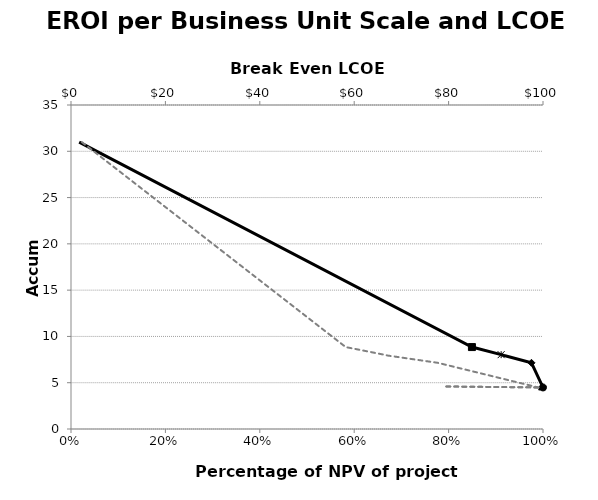
| Category | Accum EROI |
|---|---|
| 0.017330638819765813 | 30.993 |
| 0.8494138931869206 | 8.85 |
| 0.9113320791750256 | 8.03 |
| 0.9177727585819915 | 7.935 |
| 0.975544260413149 | 7.15 |
| 1.0 | 4.488 |
| 0.9981257556655942 | 4.594 |